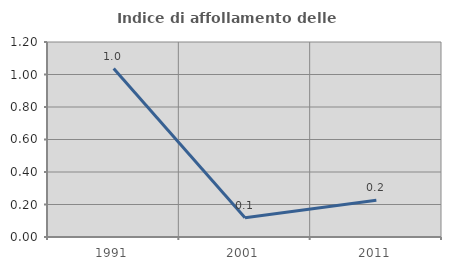
| Category | Indice di affollamento delle abitazioni  |
|---|---|
| 1991.0 | 1.036 |
| 2001.0 | 0.118 |
| 2011.0 | 0.226 |